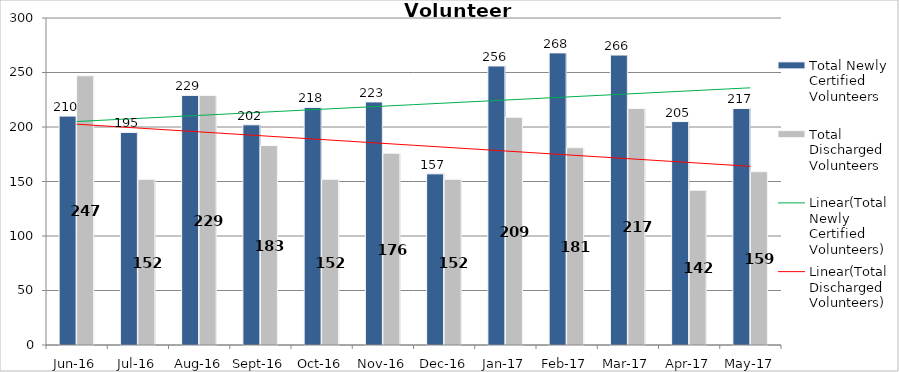
| Category | Total Newly Certified Volunteers | Total Discharged Volunteers |
|---|---|---|
| Jun-16 | 210 | 247 |
| Jul-16 | 195 | 152 |
| Aug-16 | 229 | 229 |
| Sep-16 | 202 | 183 |
| Oct-16 | 218 | 152 |
| Nov-16 | 223 | 176 |
| Dec-16 | 157 | 152 |
| Jan-17 | 256 | 209 |
| Feb-17 | 268 | 181 |
| Mar-17 | 266 | 217 |
| Apr-17 | 205 | 142 |
| May-17 | 217 | 159 |